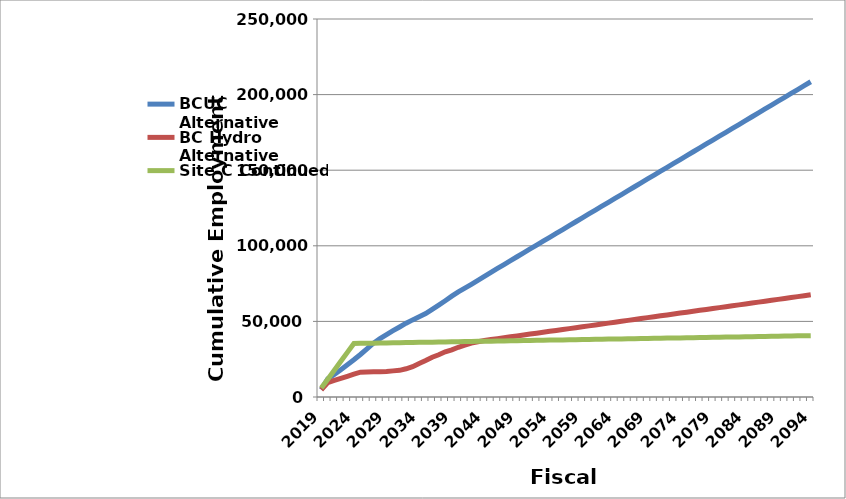
| Category | BCUC Alternative | BC Hydro Alternative | Site C Continued |
|---|---|---|---|
| 2019.0 | 4957.828 | 4777.828 | 5899.733 |
| 2020.0 | 12045.657 | 9555.657 | 11799.467 |
| 2021.0 | 14849.657 | 10931.42 | 17699.2 |
| 2022.0 | 18043.657 | 12307.184 | 23598.933 |
| 2023.0 | 21297.657 | 13682.948 | 29498.667 |
| 2024.0 | 24611.657 | 15058.711 | 35398.4 |
| 2025.0 | 28105.657 | 16434.475 | 35472.4 |
| 2026.0 | 31869.657 | 16542.441 | 35546.4 |
| 2027.0 | 35603.657 | 16650.407 | 35620.4 |
| 2028.0 | 38587.657 | 16758.373 | 35694.4 |
| 2029.0 | 41271.657 | 16866.339 | 35768.4 |
| 2030.0 | 43835.657 | 17284.305 | 35842.4 |
| 2031.0 | 46295.657 | 17628.271 | 35916.4 |
| 2032.0 | 48815.657 | 18672.837 | 35990.4 |
| 2033.0 | 51005.657 | 20060.403 | 36064.4 |
| 2034.0 | 53055.657 | 22201.769 | 36138.4 |
| 2035.0 | 55178.657 | 24085.135 | 36212.4 |
| 2036.0 | 57979.857 | 26300.301 | 36286.4 |
| 2037.0 | 60781.057 | 27937.867 | 36360.4 |
| 2038.0 | 63672.257 | 29911.033 | 36434.4 |
| 2039.0 | 66695.457 | 31239.399 | 36508.4 |
| 2040.0 | 69489.657 | 32889.165 | 36582.4 |
| 2041.0 | 72001.657 | 34270.131 | 36656.4 |
| 2042.0 | 74543.657 | 35651.097 | 36730.4 |
| 2043.0 | 77145.657 | 36516.463 | 36804.4 |
| 2044.0 | 79777.657 | 37381.829 | 36878.4 |
| 2045.0 | 82439.657 | 37985.795 | 36952.4 |
| 2046.0 | 85041.657 | 38589.761 | 37026.4 |
| 2047.0 | 87613.657 | 39193.727 | 37100.4 |
| 2048.0 | 90185.657 | 39797.693 | 37174.4 |
| 2049.0 | 92757.657 | 40401.659 | 37248.4 |
| 2050.0 | 95329.657 | 41005.625 | 37322.4 |
| 2051.0 | 97901.657 | 41609.591 | 37396.4 |
| 2052.0 | 100473.657 | 42213.557 | 37470.4 |
| 2053.0 | 103045.657 | 42817.523 | 37544.4 |
| 2054.0 | 105617.657 | 43421.489 | 37618.4 |
| 2055.0 | 108189.657 | 44025.455 | 37692.4 |
| 2056.0 | 110761.657 | 44629.421 | 37766.4 |
| 2057.0 | 113333.657 | 45233.387 | 37840.4 |
| 2058.0 | 115905.657 | 45837.353 | 37914.4 |
| 2059.0 | 118477.657 | 46441.319 | 37988.4 |
| 2060.0 | 121049.657 | 47045.285 | 38062.4 |
| 2061.0 | 123621.657 | 47649.251 | 38136.4 |
| 2062.0 | 126193.657 | 48253.217 | 38210.4 |
| 2063.0 | 128765.657 | 48857.183 | 38284.4 |
| 2064.0 | 131337.657 | 49461.149 | 38358.4 |
| 2065.0 | 133909.657 | 50065.115 | 38432.4 |
| 2066.0 | 136481.657 | 50669.081 | 38506.4 |
| 2067.0 | 139053.657 | 51273.047 | 38580.4 |
| 2068.0 | 141625.657 | 51877.013 | 38654.4 |
| 2069.0 | 144197.657 | 52480.979 | 38728.4 |
| 2070.0 | 146769.657 | 53084.945 | 38802.4 |
| 2071.0 | 149341.657 | 53688.911 | 38876.4 |
| 2072.0 | 151913.657 | 54292.877 | 38950.4 |
| 2073.0 | 154485.657 | 54896.843 | 39024.4 |
| 2074.0 | 157057.657 | 55500.809 | 39098.4 |
| 2075.0 | 159629.657 | 56104.775 | 39172.4 |
| 2076.0 | 162201.657 | 56708.741 | 39246.4 |
| 2077.0 | 164773.657 | 57312.707 | 39320.4 |
| 2078.0 | 167345.657 | 57916.673 | 39394.4 |
| 2079.0 | 169917.657 | 58520.639 | 39468.4 |
| 2080.0 | 172489.657 | 59124.605 | 39542.4 |
| 2081.0 | 175061.657 | 59728.571 | 39616.4 |
| 2082.0 | 177633.657 | 60332.537 | 39690.4 |
| 2083.0 | 180205.657 | 60936.503 | 39764.4 |
| 2084.0 | 182777.657 | 61540.469 | 39838.4 |
| 2085.0 | 185349.657 | 62144.435 | 39912.4 |
| 2086.0 | 187921.657 | 62748.401 | 39986.4 |
| 2087.0 | 190493.657 | 63352.367 | 40060.4 |
| 2088.0 | 193065.657 | 63956.333 | 40134.4 |
| 2089.0 | 195637.657 | 64560.299 | 40208.4 |
| 2090.0 | 198209.657 | 65164.265 | 40282.4 |
| 2091.0 | 200781.657 | 65768.231 | 40356.4 |
| 2092.0 | 203353.657 | 66372.197 | 40430.4 |
| 2093.0 | 205925.657 | 66976.163 | 40504.4 |
| 2094.0 | 208497.657 | 67580.129 | 40578.4 |